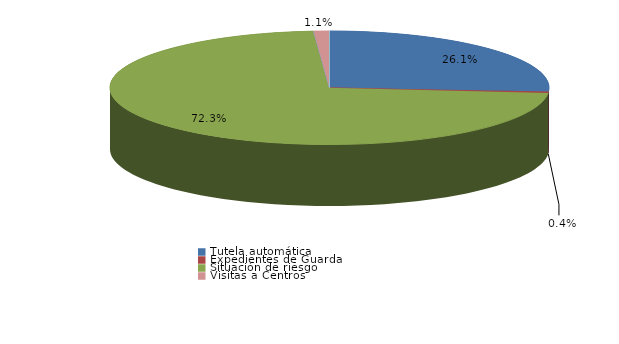
| Category | Series 0 |
|---|---|
| Tutela automática | 182 |
| Expedientes de Guarda | 3 |
| Situación de riesgo | 505 |
| Intervención en acogimientos | 0 |
| Intervención en adopciones | 0 |
| Defensa de los derechos fundamentales | 0 |
| Sustracción internacional de menores | 0 |
| Visitas a Centros | 8 |
| Ensayos Clínicos | 0 |
| Impugnación a instacia del Fiscal | 0 |
| Impugnación a instancia de particulares | 0 |